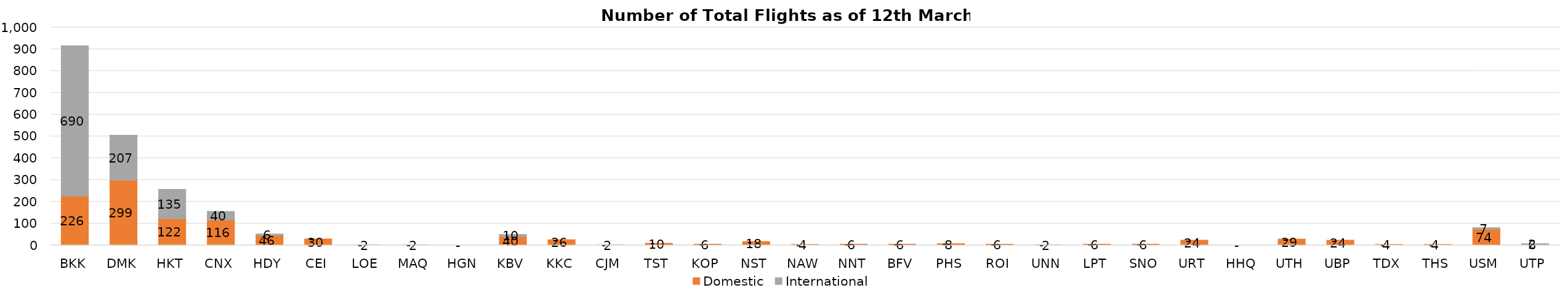
| Category | Domestic | International |
|---|---|---|
| BKK | 226 | 690 |
| DMK | 299 | 207 |
| HKT | 122 | 135 |
| CNX | 116 | 40 |
| HDY | 46 | 6 |
| CEI | 30 | 0 |
| LOE | 2 | 0 |
| MAQ | 2 | 0 |
| HGN | 0 | 0 |
| KBV | 40 | 10 |
| KKC | 26 | 0 |
| CJM | 2 | 0 |
| TST | 10 | 0 |
| KOP | 6 | 0 |
| NST | 18 | 0 |
| NAW | 4 | 0 |
| NNT | 6 | 0 |
| BFV | 6 | 0 |
| PHS | 8 | 0 |
| ROI | 6 | 0 |
| UNN | 2 | 0 |
| LPT | 6 | 0 |
| SNO | 6 | 0 |
| URT | 24 | 0 |
| HHQ | 0 | 0 |
| UTH | 29 | 0 |
| UBP | 24 | 0 |
| TDX | 4 | 0 |
| THS | 4 | 0 |
| USM | 74 | 7 |
| UTP | 6 | 2 |